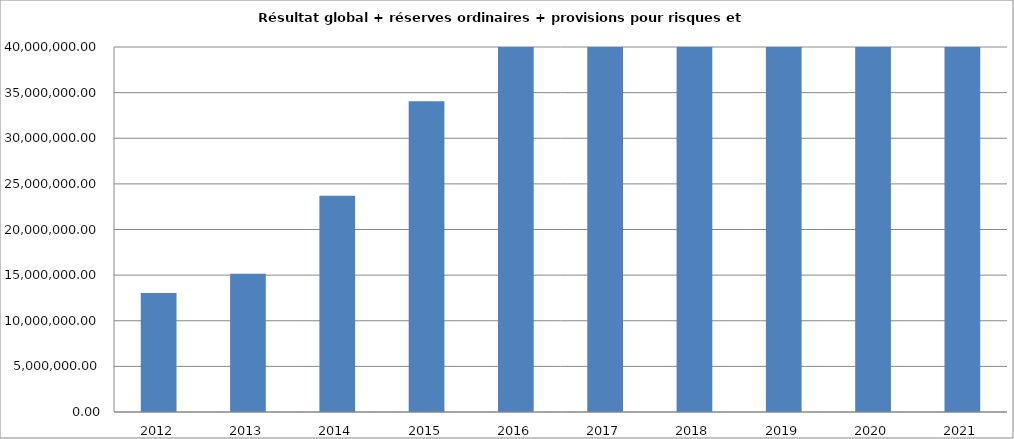
| Category | Series 0 |
|---|---|
| 2012.0 | 13034919.39 |
| 2013.0 | 15158526.59 |
| 2014.0 | 23695208.38 |
| 2015.0 | 34052913.23 |
| 2016.0 | 41577185.76 |
| 2017.0 | 57577023.41 |
| 2018.0 | 73433232.94 |
| 2019.0 | 52489476.8 |
| 2020.0 | 84611398.68 |
| 2021.0 | 88362333.53 |